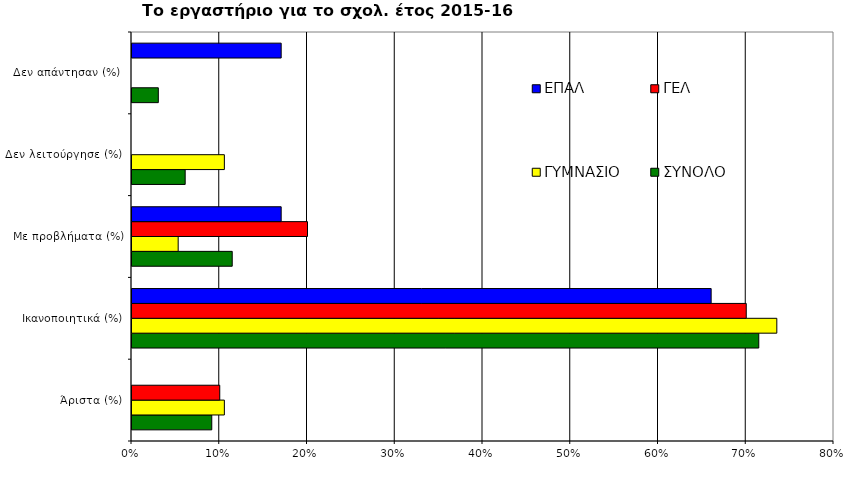
| Category | ΣΥΝΟΛΟ | ΓΥΜΝΑΣΙΟ | ΓΕΛ | ΕΠΑΛ |
|---|---|---|---|---|
|  Άριστα (%) | 0.091 | 0.105 | 0.1 | 0 |
|  Ικανοποιητικά (%) | 0.714 | 0.735 | 0.7 | 0.66 |
|  Με προβλήματα (%) | 0.114 | 0.053 | 0.2 | 0.17 |
|  Δεν λειτούργησε (%)  | 0.061 | 0.105 | 0 | 0 |
|  Δεν απάντησαν (%)  | 0.03 | 0 | 0 | 0.17 |